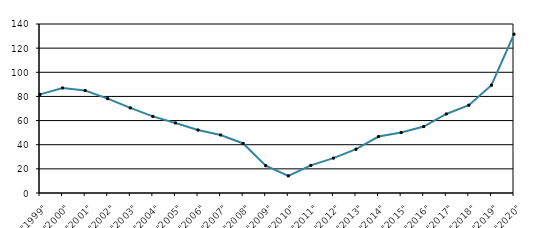
| Category | Series 1 |
|---|---|
| "1999" | 81.693 |
| "2000" | 87.026 |
| "2001" | 84.841 |
| "2002" | 78.14 |
| "2003" | 70.488 |
| "2004" | 63.486 |
| "2005" | 58.019 |
| "2006" | 52.153 |
| "2007" | 48.074 |
| "2008" | 41.026 |
| "2009" | 22.636 |
| "2010" | 14.148 |
| "2011" | 22.867 |
| "2012" | 28.927 |
| "2013" | 36.282 |
| "2014" | 46.751 |
| "2015" | 50.05 |
| "2016" | 55.027 |
| "2017" | 65.482 |
| "2018" | 72.756 |
| "2019" | 89.339 |
| "2020" | 131.572 |